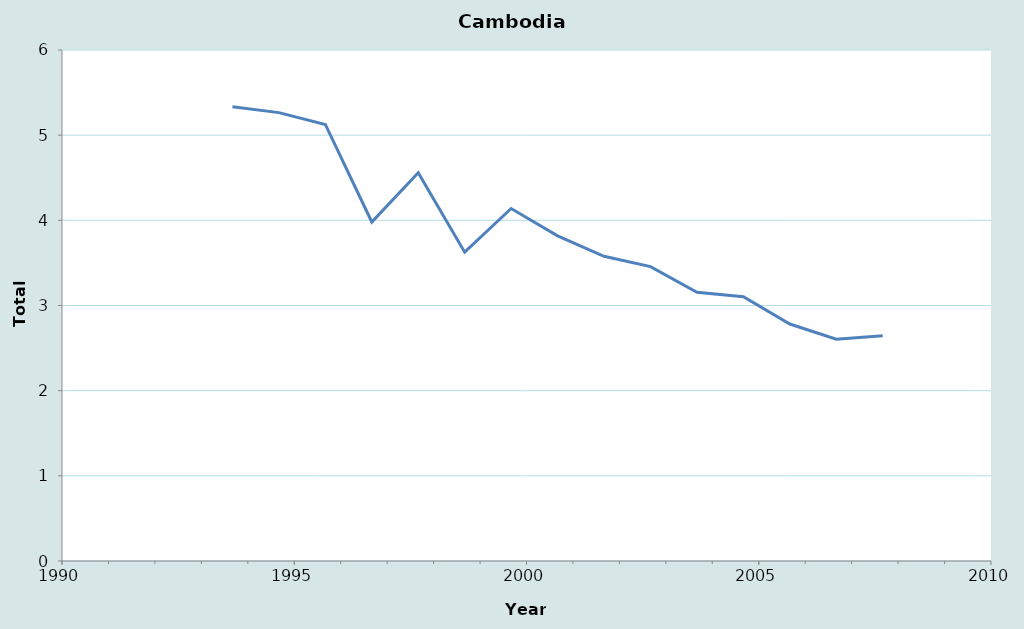
| Category | Series 0 |
|---|---|
| 2007.6693989071039 | 2.645 |
| 2006.6693989071039 | 2.604 |
| 2005.6693989071039 | 2.782 |
| 2004.6693989071039 | 3.103 |
| 2003.6693989071039 | 3.155 |
| 2002.6693989071039 | 3.456 |
| 2001.6693989071039 | 3.578 |
| 2000.6693989071039 | 3.818 |
| 1999.6693989071039 | 4.139 |
| 1998.6693989071039 | 3.626 |
| 1997.6693989071039 | 4.559 |
| 1996.6693989071039 | 3.98 |
| 1995.6693989071039 | 5.126 |
| 1994.6693989071039 | 5.265 |
| 1993.6693989071039 | 5.334 |